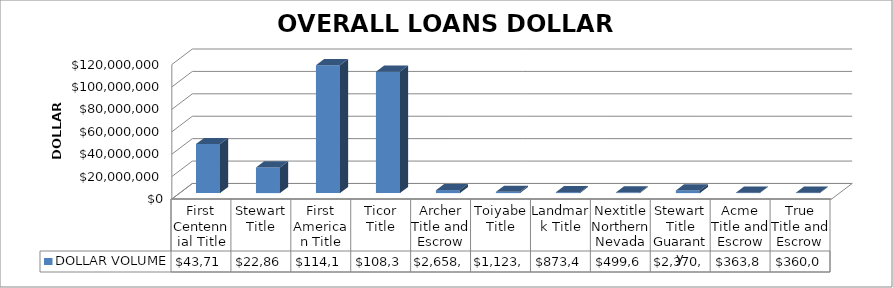
| Category | DOLLAR VOLUME |
|---|---|
| First Centennial Title | 43714090.33 |
| Stewart Title | 22861161 |
| First American Title | 114105527.47 |
| Ticor Title | 108315344 |
| Archer Title and Escrow | 2658222 |
| Toiyabe Title | 1123500 |
| Landmark Title | 873479 |
| Nextitle Northern Nevada | 499643 |
| Stewart Title Guaranty | 2370000 |
| Acme Title and Escrow | 363858 |
| True Title and Escrow | 360000 |